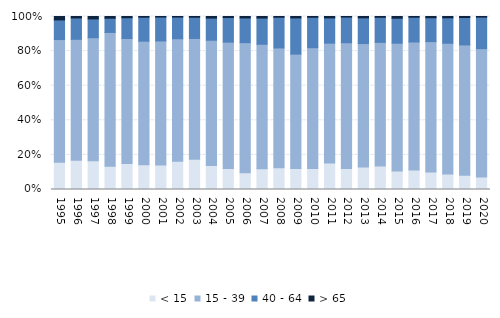
| Category | < 15 | 15 - 39 | 40 - 64 | > 65 |
|---|---|---|---|---|
| 1995.0 | 15.802 | 70.864 | 11.358 | 1.975 |
| 1996.0 | 16.946 | 69.874 | 12.343 | 0.837 |
| 1997.0 | 16.634 | 71.089 | 10.891 | 1.386 |
| 1998.0 | 13.4 | 77.387 | 8.208 | 1.005 |
| 1999.0 | 14.964 | 72.328 | 11.995 | 0.713 |
| 2000.0 | 14.371 | 71.358 | 13.875 | 0.396 |
| 2001.0 | 14.227 | 71.628 | 13.816 | 0.329 |
| 2002.0 | 16.316 | 70.816 | 12.532 | 0.336 |
| 2003.0 | 17.496 | 69.811 | 12.264 | 0.429 |
| 2004.0 | 13.923 | 72.358 | 12.805 | 0.915 |
| 2005.0 | 12.169 | 73.012 | 14.217 | 0.602 |
| 2006.0 | 9.661 | 75.227 | 14.286 | 0.826 |
| 2007.0 | 11.985 | 71.972 | 15.155 | 0.888 |
| 2008.0 | 12.587 | 69.231 | 17.732 | 0.45 |
| 2009.0 | 12.204 | 66.062 | 20.928 | 0.807 |
| 2010.0 | 12.092 | 69.869 | 17.582 | 0.458 |
| 2011.0 | 15.287 | 69.311 | 14.592 | 0.811 |
| 2012.0 | 12.14 | 72.696 | 14.822 | 0.341 |
| 2013.0 | 13.035 | 71.332 | 14.863 | 0.77 |
| 2014.0 | 13.514 | 71.542 | 14.467 | 0.477 |
| 2015.0 | 10.699 | 73.871 | 14.462 | 0.968 |
| 2016.0 | 11.27 | 73.993 | 14.329 | 0.408 |
| 2017.0 | 10.155 | 75.317 | 13.822 | 0.705 |
| 2018.0 | 8.917 | 75.625 | 14.708 | 0.75 |
| 2019.0 | 8.237 | 75.326 | 15.875 | 0.563 |
| 2020.0 | 7.191 | 74.237 | 18.21 | 0.362 |